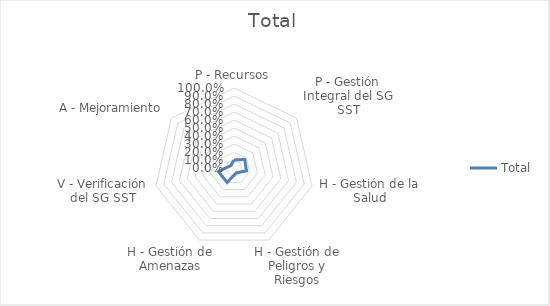
| Category | Total |
|---|---|
| P - Recursos | 0.1 |
| P - Gestión Integral del SG SST | 0.171 |
| H - Gestión de la Salud | 0.16 |
| H - Gestión de Peligros y Riesgos | 0.067 |
| H - Gestión de Amenazas | 0.2 |
| V - Verificación del SG SST | 0.2 |
| A - Mejoramiento | 0.05 |